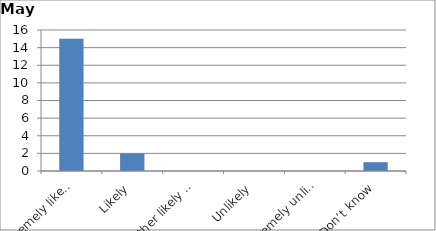
| Category | Series 0 |
|---|---|
| Extremely likely | 15 |
| Likely | 2 |
| Neither likely nor unlikely | 0 |
| Unlikely | 0 |
| Extremely unlikely | 0 |
| Don’t know | 1 |